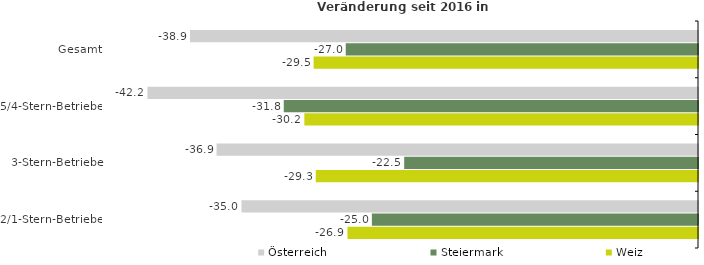
| Category | Österreich | Steiermark | Weiz |
|---|---|---|---|
| Gesamt | -38.943 | -27.005 | -29.467 |
| 5/4-Stern-Betriebe | -42.206 | -31.755 | -30.178 |
| 3-Stern-Betriebe | -36.907 | -22.524 | -29.303 |
| 2/1-Stern-Betriebe | -34.996 | -25 | -26.871 |